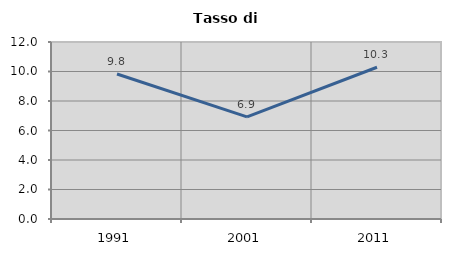
| Category | Tasso di disoccupazione   |
|---|---|
| 1991.0 | 9.831 |
| 2001.0 | 6.928 |
| 2011.0 | 10.288 |